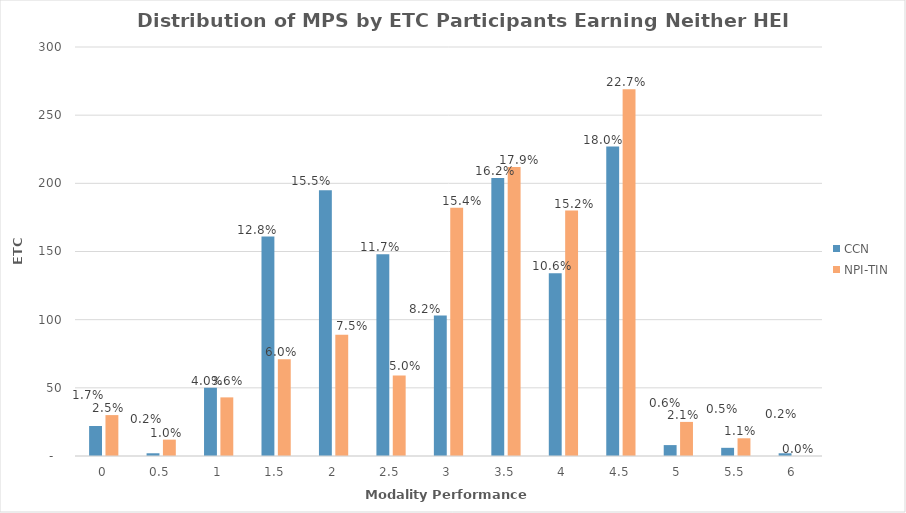
| Category | CCN | NPI-TIN |
|---|---|---|
| 0.0 | 22 | 30 |
| 0.5 | 2 | 12 |
| 1.0 | 50 | 43 |
| 1.5 | 161 | 71 |
| 2.0 | 195 | 89 |
| 2.5 | 148 | 59 |
| 3.0 | 103 | 182 |
| 3.5 | 204 | 212 |
| 4.0 | 134 | 180 |
| 4.5 | 227 | 269 |
| 5.0 | 8 | 25 |
| 5.5 | 6 | 13 |
| 6.0 | 2 | 0 |